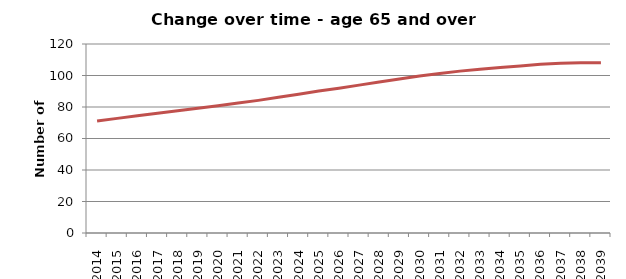
| Category | Northumberland |
|---|---|
| 2014.0 | 71.144 |
| 2015.0 | 72.774 |
| 2016.0 | 74.505 |
| 2017.0 | 76.049 |
| 2018.0 | 77.591 |
| 2019.0 | 79.254 |
| 2020.0 | 80.786 |
| 2021.0 | 82.49 |
| 2022.0 | 84.203 |
| 2023.0 | 86.133 |
| 2024.0 | 88.138 |
| 2025.0 | 90.103 |
| 2026.0 | 91.964 |
| 2027.0 | 93.888 |
| 2028.0 | 95.807 |
| 2029.0 | 97.769 |
| 2030.0 | 99.702 |
| 2031.0 | 101.285 |
| 2032.0 | 102.772 |
| 2033.0 | 104.001 |
| 2034.0 | 105.107 |
| 2035.0 | 106.012 |
| 2036.0 | 107.114 |
| 2037.0 | 107.767 |
| 2038.0 | 108.082 |
| 2039.0 | 108.105 |